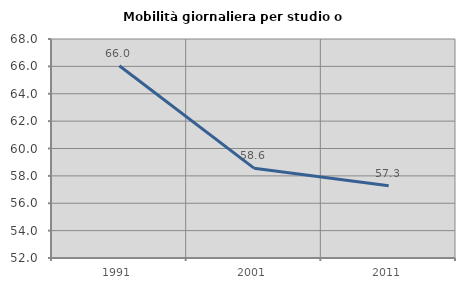
| Category | Mobilità giornaliera per studio o lavoro |
|---|---|
| 1991.0 | 66.045 |
| 2001.0 | 58.562 |
| 2011.0 | 57.277 |